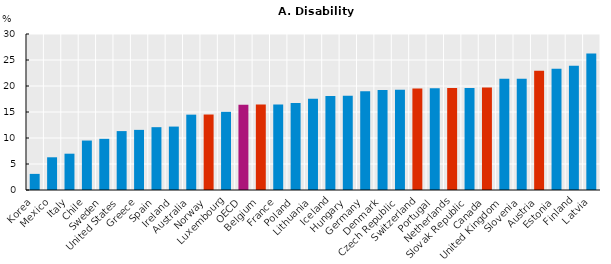
| Category | 2016-2019 |
|---|---|
| Korea | 3.099 |
| Mexico | 6.29 |
| Italy | 6.981 |
| Chile | 9.51 |
| Sweden | 9.84 |
| United States | 11.329 |
| Greece | 11.564 |
| Spain | 12.081 |
| Ireland | 12.197 |
| Australia | 14.49 |
| Norway | 14.515 |
| Luxembourg | 15.035 |
| OECD | 16.407 |
| Belgium | 16.423 |
| France | 16.444 |
| Poland | 16.753 |
| Lithuania | 17.565 |
| Iceland | 18.065 |
| Hungary | 18.146 |
| Germany | 18.99 |
| Denmark | 19.223 |
| Czech Republic | 19.296 |
| Switzerland | 19.502 |
| Portugal | 19.582 |
| Netherlands | 19.607 |
| Slovak Republic | 19.621 |
| Canada | 19.7 |
| United Kingdom | 21.38 |
| Slovenia | 21.405 |
| Austria | 22.941 |
| Estonia | 23.33 |
| Finland | 23.885 |
| Latvia | 26.233 |